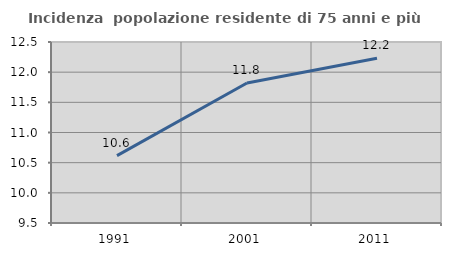
| Category | Incidenza  popolazione residente di 75 anni e più |
|---|---|
| 1991.0 | 10.616 |
| 2001.0 | 11.82 |
| 2011.0 | 12.231 |